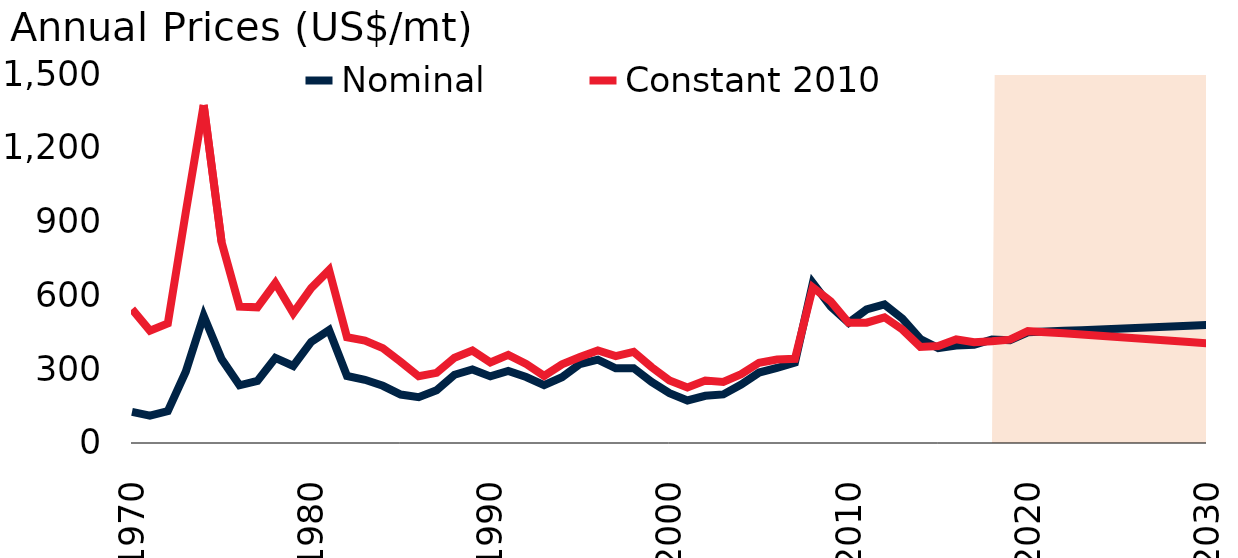
| Category | Nominal | Constant 2010 |
|---|---|---|
| 1970.0 | 126.308 | 544.09 |
| 1971.0 | 111.538 | 456.847 |
| 1972.0 | 129.449 | 486.054 |
| 1973.0 | 289.58 | 937.559 |
| 1974.0 | 517.165 | 1373.979 |
| 1975.0 | 341.428 | 816.759 |
| 1976.0 | 234.681 | 554.592 |
| 1977.0 | 252.225 | 551.404 |
| 1978.0 | 345.658 | 650.249 |
| 1979.0 | 313.069 | 527.953 |
| 1980.0 | 410.742 | 629.738 |
| 1981.0 | 458.989 | 702.906 |
| 1982.0 | 272.482 | 430.094 |
| 1983.0 | 256.802 | 416.388 |
| 1984.0 | 232.499 | 385.465 |
| 1985.0 | 196.929 | 329.933 |
| 1986.0 | 186.245 | 271.294 |
| 1987.0 | 214.608 | 285.269 |
| 1988.0 | 277.471 | 346.349 |
| 1989.0 | 299.162 | 375.676 |
| 1990.0 | 270.854 | 327.624 |
| 1991.0 | 293.279 | 358.041 |
| 1992.0 | 268.221 | 321.441 |
| 1993.0 | 235.412 | 272.712 |
| 1994.0 | 267.592 | 319.589 |
| 1995.0 | 320.958 | 349.171 |
| 1996.0 | 338.875 | 375.824 |
| 1997.0 | 303.51 | 353.238 |
| 1998.0 | 304.158 | 370.153 |
| 1999.0 | 248.417 | 308.242 |
| 2000.0 | 202.396 | 254.395 |
| 2001.0 | 172.838 | 225.706 |
| 2002.0 | 191.873 | 253.523 |
| 2003.0 | 197.617 | 248.206 |
| 2004.0 | 237.667 | 279.522 |
| 2005.0 | 286.271 | 326.404 |
| 2006.0 | 304.876 | 339.03 |
| 2007.0 | 326.432 | 342.065 |
| 2008.0 | 650.188 | 632.27 |
| 2009.0 | 554.993 | 575.348 |
| 2010.0 | 488.907 | 488.907 |
| 2011.0 | 543.029 | 489.234 |
| 2012.0 | 562.983 | 510.989 |
| 2013.0 | 505.892 | 461.182 |
| 2014.0 | 422.833 | 390.726 |
| 2015.0 | 386 | 394.449 |
| 2016.0 | 396.167 | 421.303 |
| 2017.0 | 398.917 | 409.897 |
| 2018.0 | 420.667 | 413.311 |
| 2019.0 | 418 | 420.193 |
| 2020.0 | 450 | 454.594 |
| 2021.0 | 452.914 | 450.343 |
| 2022.0 | 455.846 | 445.789 |
| 2023.0 | 458.798 | 441.023 |
| 2024.0 | 461.768 | 436.103 |
| 2025.0 | 464.758 | 431.066 |
| 2026.0 | 467.767 | 425.938 |
| 2027.0 | 470.796 | 420.74 |
| 2028.0 | 473.844 | 415.487 |
| 2029.0 | 476.912 | 410.191 |
| 2030.0 | 480 | 404.859 |